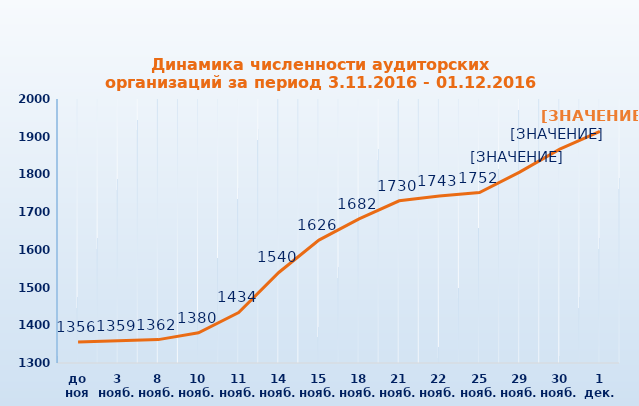
| Category | Series 0 |
|---|---|
| до ноя | 1356 |
| 3 ноя | 1359 |
| 8 ноя | 1362 |
| 10 ноя | 1380 |
| 11 ноя | 1434 |
| 14 ноя | 1540 |
| 15 ноя | 1626 |
| 18 ноя | 1682 |
| 21 ноя | 1730 |
| 22 ноя | 1743 |
| 25 ноя | 1752 |
| 29 ноя | 1806 |
| 30 ноя | 1867 |
| 1 дек | 1914 |